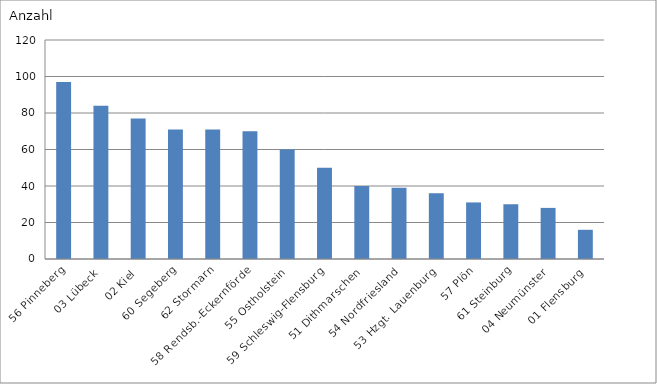
| Category | 56 Pinneberg |
|---|---|
| 56 Pinneberg | 97 |
| 03 Lübeck | 84 |
| 02 Kiel | 77 |
| 60 Segeberg | 71 |
| 62 Stormarn | 71 |
| 58 Rendsb.-Eckernförde | 70 |
| 55 Ostholstein | 60 |
| 59 Schleswig-Flensburg | 50 |
| 51 Dithmarschen | 40 |
| 54 Nordfriesland | 39 |
| 53 Hzgt. Lauenburg | 36 |
| 57 Plön | 31 |
| 61 Steinburg | 30 |
| 04 Neumünster | 28 |
| 01 Flensburg | 16 |